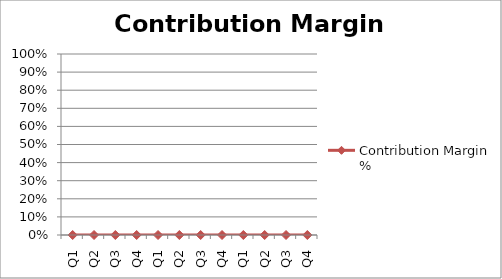
| Category | Contribution Margin % |
|---|---|
| Q1 | 0 |
| Q2 | 0 |
| Q3 | 0 |
| Q4 | 0 |
| Q1 | 0 |
| Q2 | 0 |
| Q3 | 0 |
| Q4 | 0 |
| Q1 | 0 |
| Q2 | 0 |
| Q3 | 0 |
| Q4 | 0 |